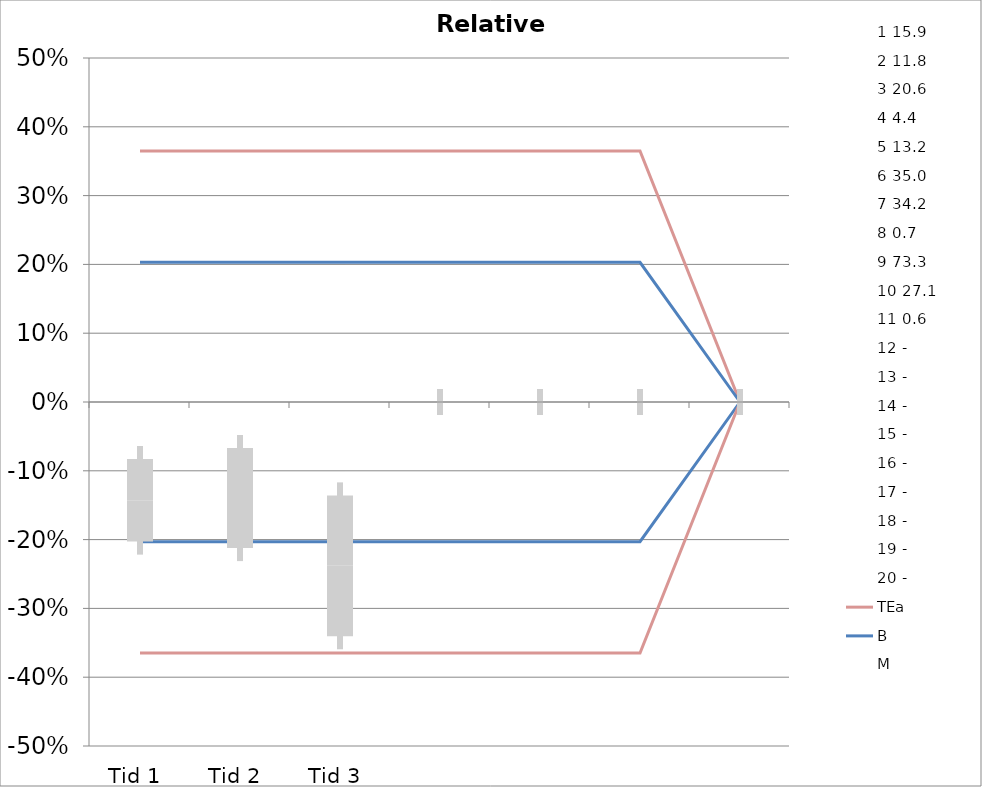
| Category | 1 | 2 | 3 | 4 | 5 | 6 | 7 | 8 | 9 | 10 | 11 | 12 | 13 | 14 | 15 | 16 | 17 | 18 | 19 | 20 | TEa | B | -B | -TEa | M |
|---|---|---|---|---|---|---|---|---|---|---|---|---|---|---|---|---|---|---|---|---|---|---|---|---|---|
| Tid 1 | -0.145 | -0.119 | -0.214 | -0.227 | -0.106 | -0.194 | -0.117 | -0.286 | -0.005 | 0.007 | -0.167 | 0 | 0 | 0 | 0 | 0 | 0 | 0 | 0 | 0 | 0.365 | 0.203 | -0.203 | -0.365 | -0.143 |
| Tid 2 | -0.119 | -0.119 | -0.194 | -0.205 | 0 | 0 | 0 | -0.286 | -0.113 | -0.081 | 0 | 0 | 0 | 0 | 0 | 0 | 0 | 0 | 0 | 0 | 0.365 | 0.203 | -0.203 | -0.365 | -0.14 |
| Tid 3 | -0.208 | -0.169 | -0.257 | -0.318 | 0 | 0 | 0 | 0 | 0 | 0 | 0 | 0 | 0 | 0 | 0 | 0 | 0 | 0 | 0 | 0 | 0.365 | 0.203 | -0.203 | -0.365 | -0.238 |